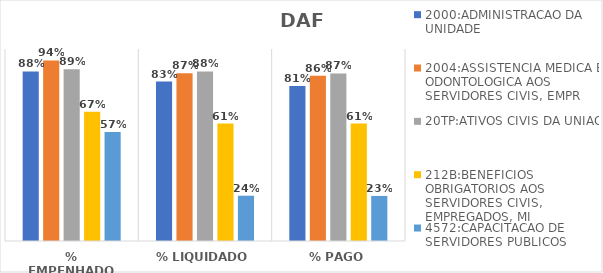
| Category | 2000:ADMINISTRACAO DA UNIDADE | 2004:ASSISTENCIA MEDICA E ODONTOLOGICA AOS SERVIDORES CIVIS, EMPR | 20TP:ATIVOS CIVIS DA UNIAO | 212B:BENEFICIOS OBRIGATORIOS AOS SERVIDORES CIVIS, EMPREGADOS, MI | 4572:CAPACITACAO DE SERVIDORES PUBLICOS FEDERAIS EM PROCESSO DE Q |
|---|---|---|---|---|---|
| % EMPENHADO | 0.883 | 0.94 | 0.895 | 0.673 | 0.568 |
| % LIQUIDADO | 0.831 | 0.874 | 0.883 | 0.612 | 0.236 |
| % PAGO | 0.808 | 0.861 | 0.873 | 0.612 | 0.235 |